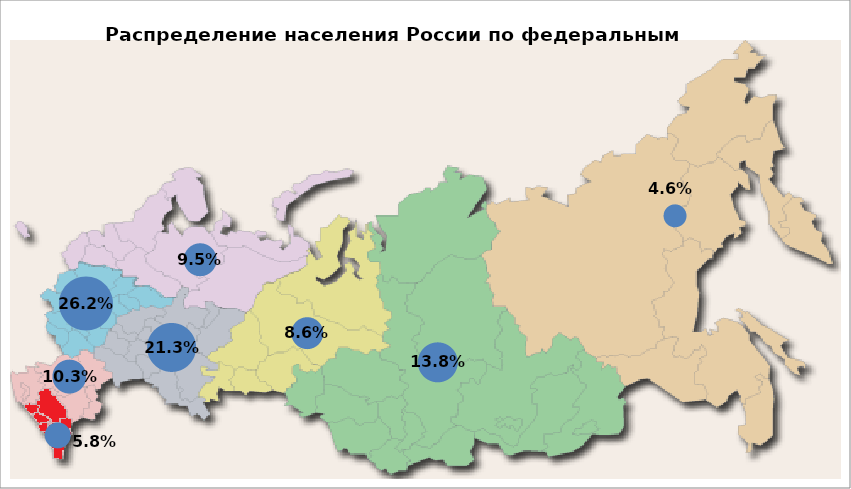
| Category | Доля населения, % |
|---|---|
| 3.2 | 12 |
| 2.5 | 7 |
| 8.0 | 15 |
| 28.0 | 18 |
| 18.0 | 8 |
| 12.5 | 10 |
| 6.8 | 9 |
| 2.0 | 3 |